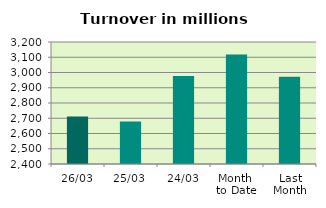
| Category | Series 0 |
|---|---|
| 26/03 | 2712.223 |
| 25/03 | 2679.052 |
| 24/03 | 2977.017 |
| Month 
to Date | 3118.303 |
| Last
Month | 2972.107 |